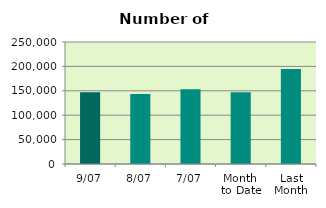
| Category | Series 0 |
|---|---|
| 9/07 | 146824 |
| 8/07 | 143564 |
| 7/07 | 153234 |
| Month 
to Date | 146966.857 |
| Last
Month | 194460.727 |